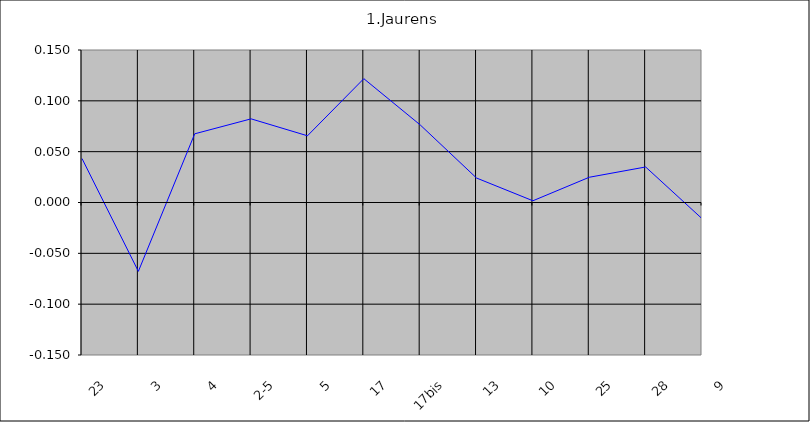
| Category | Jaurens |
|---|---|
| 23 | 0.043 |
| 3 | -0.068 |
| 4 | 0.068 |
| 2-5 | 0.082 |
| 5 | 0.066 |
| 17 | 0.122 |
| 17bis | 0.076 |
| 13 | 0.024 |
| 10 | 0.002 |
| 25 | 0.025 |
| 28 | 0.035 |
| 9 | -0.016 |